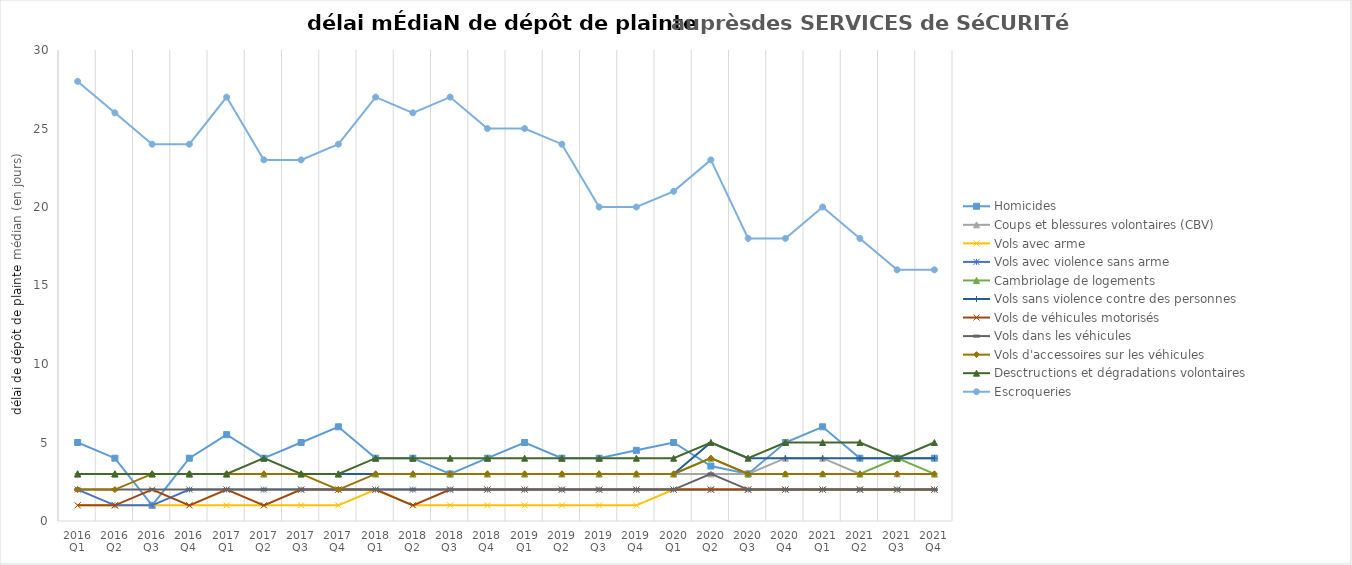
| Category | Homicides | Coups et blessures volontaires (CBV) | Vols avec arme | Vols avec violence sans arme | Cambriolage de logements | Vols sans violence contre des personnes | Vols de véhicules motorisés | Vols dans les véhicules | Vols d'accessoires sur les véhicules | Desctructions et dégradations volontaires | Escroqueries |
|---|---|---|---|---|---|---|---|---|---|---|---|
| 2016 Q1 | 5 | 3 | 1 | 2 | 3 | 3 | 1 | 2 | 2 | 3 | 28 |
| 2016 Q2 | 4 | 3 | 1 | 1 | 3 | 3 | 1 | 2 | 2 | 3 | 26 |
| 2016 Q3 | 1 | 3 | 1 | 1 | 3 | 3 | 2 | 2 | 3 | 3 | 24 |
| 2016 Q4 | 4 | 3 | 1 | 2 | 3 | 3 | 1 | 2 | 3 | 3 | 24 |
| 2017 Q1 | 5.5 | 3 | 1 | 2 | 3 | 3 | 2 | 2 | 3 | 3 | 27 |
| 2017 Q2 | 4 | 3 | 1 | 2 | 3 | 3 | 1 | 2 | 3 | 4 | 23 |
| 2017 Q3 | 5 | 3 | 1 | 2 | 3 | 3 | 2 | 2 | 3 | 3 | 23 |
| 2017 Q4 | 6 | 3 | 1 | 2 | 3 | 3 | 2 | 2 | 2 | 3 | 24 |
| 2018 Q1 | 4 | 3 | 2 | 2 | 3 | 3 | 2 | 2 | 3 | 4 | 27 |
| 2018 Q2 | 4 | 3 | 1 | 2 | 3 | 3 | 1 | 2 | 3 | 4 | 26 |
| 2018 Q3 | 3 | 3 | 1 | 2 | 3 | 3 | 2 | 2 | 3 | 4 | 27 |
| 2018 Q4 | 4 | 3 | 1 | 2 | 3 | 3 | 2 | 2 | 3 | 4 | 25 |
| 2019 Q1 | 5 | 3 | 1 | 2 | 3 | 3 | 2 | 2 | 3 | 4 | 25 |
| 2019 Q2 | 4 | 3 | 1 | 2 | 3 | 3 | 2 | 2 | 3 | 4 | 24 |
| 2019 Q3 | 4 | 3 | 1 | 2 | 3 | 3 | 2 | 2 | 3 | 4 | 20 |
| 2019 Q4 | 4.5 | 3 | 1 | 2 | 3 | 3 | 2 | 2 | 3 | 4 | 20 |
| 2020 Q1 | 5 | 3 | 2 | 2 | 3 | 3 | 2 | 2 | 3 | 4 | 21 |
| 2020 Q2 | 3.5 | 3 | 2 | 2 | 4 | 5 | 2 | 3 | 4 | 5 | 23 |
| 2020 Q3 | 3 | 3 | 2 | 2 | 3 | 4 | 2 | 2 | 3 | 4 | 18 |
| 2020 Q4 | 5 | 4 | 2 | 2 | 3 | 4 | 2 | 2 | 3 | 5 | 18 |
| 2021 Q1 | 6 | 4 | 2 | 2 | 3 | 4 | 2 | 2 | 3 | 5 | 20 |
| 2021 Q2 | 4 | 3 | 2 | 2 | 3 | 4 | 2 | 2 | 3 | 5 | 18 |
| 2021 Q3 | 4 | 3 | 2 | 2 | 4 | 4 | 2 | 2 | 3 | 4 | 16 |
| 2021 Q4 | 4 | 3 | 2 | 2 | 3 | 4 | 2 | 2 | 3 | 5 | 16 |